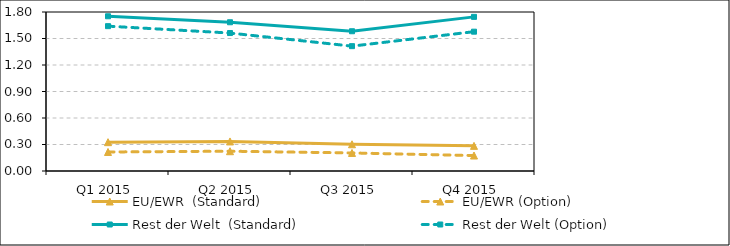
| Category | EU/EWR  (Standard) | EU/EWR (Option) | Rest der Welt  (Standard) | Rest der Welt (Option) |
|---|---|---|---|---|
| Q1 2015 | 0.326 | 0.215 | 1.752 | 1.64 |
| Q2 2015 | 0.335 | 0.224 | 1.684 | 1.562 |
| Q3 2015 | 0.303 | 0.204 | 1.582 | 1.413 |
| Q4 2015 | 0.284 | 0.175 | 1.745 | 1.577 |